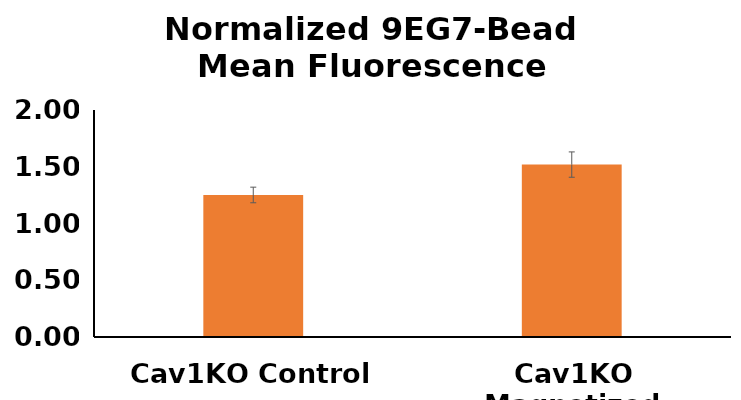
| Category | Series 0 |
|---|---|
| Cav1KO Control | 1.251 |
| Cav1KO Magnetized | 1.519 |